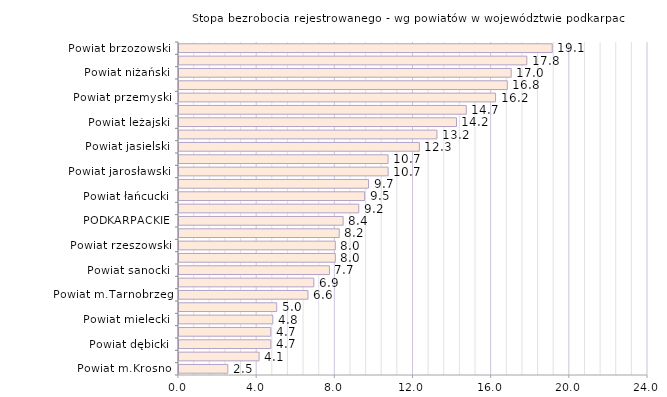
| Category | Stopa bezrobocia rejestrowanego - wg powiatów w województwie podkarpackim |
|---|---|
| Powiat m.Krosno | 2.5 |
| Powiat m.Rzeszów | 4.1 |
| Powiat dębicki | 4.7 |
| Powiat stalowowolski | 4.7 |
| Powiat mielecki | 4.8 |
| POLSKA | 5 |
| Powiat m.Tarnobrzeg | 6.6 |
| Powiat tarnobrzeski | 6.9 |
| Powiat sanocki | 7.7 |
| Powiat krośnieński | 8 |
| Powiat rzeszowski | 8 |
| Powiat kolbuszowski | 8.2 |
| PODKARPACKIE | 8.4 |
| Powiat m.Przemyśl | 9.2 |
| Powiat łańcucki | 9.5 |
| Powiat lubaczowski | 9.7 |
| Powiat jarosławski | 10.7 |
| Powiat ropczycko-sędziszowski | 10.7 |
| Powiat jasielski | 12.3 |
| Powiat przeworski | 13.2 |
| Powiat leżajski | 14.2 |
| Powiat bieszczadzki | 14.7 |
| Powiat przemyski | 16.2 |
| Powiat strzyżowski | 16.8 |
| Powiat niżański | 17 |
| Powiat leski | 17.8 |
| Powiat brzozowski | 19.1 |